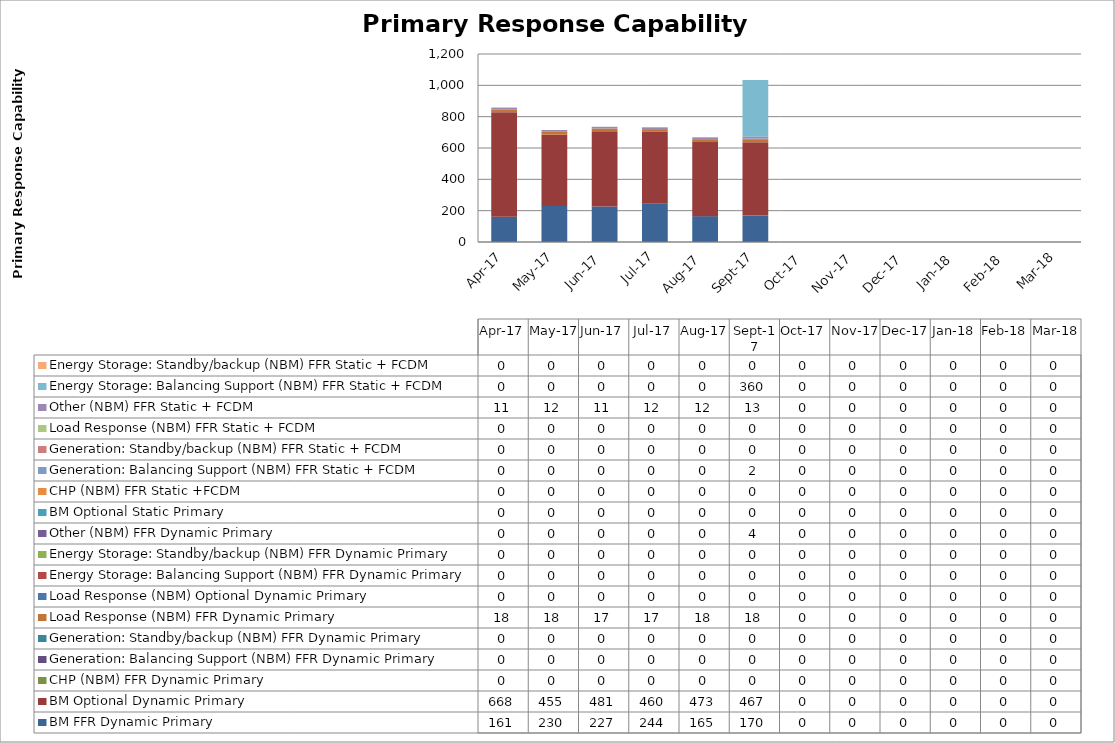
| Category | BM FFR Dynamic Primary | BM Optional Dynamic Primary | CHP (NBM) FFR Dynamic Primary | Generation: Balancing Support (NBM) FFR Dynamic Primary | Generation: Standby/backup (NBM) FFR Dynamic Primary | Load Response (NBM) FFR Dynamic Primary | Load Response (NBM) Optional Dynamic Primary | Energy Storage: Balancing Support (NBM) FFR Dynamic Primary | Energy Storage: Standby/backup (NBM) FFR Dynamic Primary | Other (NBM) FFR Dynamic Primary | BM Optional Static Primary | CHP (NBM) FFR Static +FCDM | Generation: Balancing Support (NBM) FFR Static + FCDM | Generation: Standby/backup (NBM) FFR Static + FCDM | Load Response (NBM) FFR Static + FCDM | Other (NBM) FFR Static + FCDM | Energy Storage: Balancing Support (NBM) FFR Static + FCDM | Energy Storage: Standby/backup (NBM) FFR Static + FCDM |
|---|---|---|---|---|---|---|---|---|---|---|---|---|---|---|---|---|---|---|
| 2017-04-01 | 161.33 | 667.54 | 0 | 0 | 0 | 17.82 | 0 | 0 | 0 | 0 | 0 | 0 | 0 | 0 | 0 | 11.203 | 0 | 0 |
| 2017-05-01 | 230.081 | 454.7 | 0 | 0 | 0 | 18.414 | 0 | 0 | 0 | 0 | 0 | 0 | 0 | 0 | 0 | 11.68 | 0 | 0 |
| 2017-06-01 | 226.552 | 480.664 | 0 | 0 | 0 | 17.226 | 0 | 0 | 0 | 0 | 0 | 0 | 0 | 0 | 0 | 10.862 | 0 | 0 |
| 2017-07-01 | 243.518 | 459.686 | 0 | 0 | 0 | 17.226 | 0 | 0 | 0 | 0 | 0 | 0 | 0 | 0 | 0 | 11.554 | 0 | 0 |
| 2017-08-01 | 165.083 | 472.838 | 0 | 0 | 0 | 18.414 | 0 | 0 | 0 | 0 | 0 | 0 | 0 | 0 | 0 | 11.744 | 0 | 0 |
| 2017-09-01 | 170.151 | 466.921 | 0 | 0 | 0 | 17.82 | 0 | 0 | 0 | 4.274 | 0 | 0 | 1.843 | 0 | 0 | 12.639 | 360.068 | 0 |
| 2017-10-01 | 0 | 0 | 0 | 0 | 0 | 0 | 0 | 0 | 0 | 0 | 0 | 0 | 0 | 0 | 0 | 0 | 0 | 0 |
| 2017-11-01 | 0 | 0 | 0 | 0 | 0 | 0 | 0 | 0 | 0 | 0 | 0 | 0 | 0 | 0 | 0 | 0 | 0 | 0 |
| 2017-12-01 | 0 | 0 | 0 | 0 | 0 | 0 | 0 | 0 | 0 | 0 | 0 | 0 | 0 | 0 | 0 | 0 | 0 | 0 |
| 2018-01-01 | 0 | 0 | 0 | 0 | 0 | 0 | 0 | 0 | 0 | 0 | 0 | 0 | 0 | 0 | 0 | 0 | 0 | 0 |
| 2018-02-01 | 0 | 0 | 0 | 0 | 0 | 0 | 0 | 0 | 0 | 0 | 0 | 0 | 0 | 0 | 0 | 0 | 0 | 0 |
| 2018-03-01 | 0 | 0 | 0 | 0 | 0 | 0 | 0 | 0 | 0 | 0 | 0 | 0 | 0 | 0 | 0 | 0 | 0 | 0 |